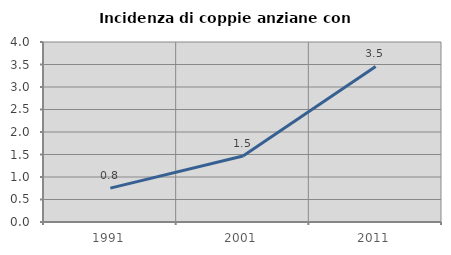
| Category | Incidenza di coppie anziane con figli |
|---|---|
| 1991.0 | 0.753 |
| 2001.0 | 1.467 |
| 2011.0 | 3.458 |